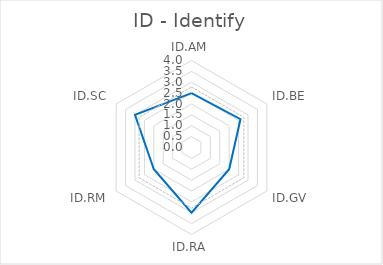
| Category | Ratings | Average |
|---|---|---|
| ID.AM | 2.5 | 2.781 |
| ID.BE | 2.6 | 2.781 |
| ID.GV | 2 | 2.781 |
| ID.RA | 3 | 2.781 |
| ID.RM | 2 | 2.781 |
| ID.SC | 3 | 2.781 |